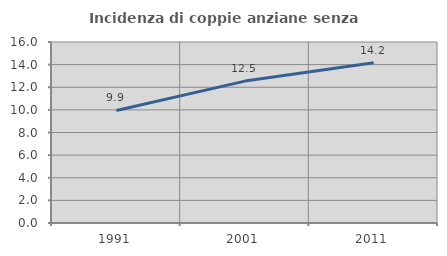
| Category | Incidenza di coppie anziane senza figli  |
|---|---|
| 1991.0 | 9.945 |
| 2001.0 | 12.544 |
| 2011.0 | 14.165 |